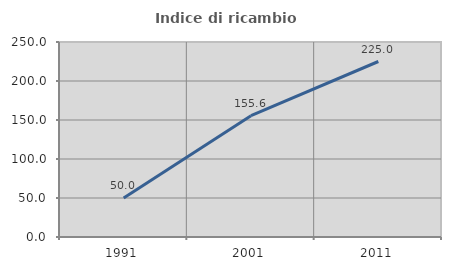
| Category | Indice di ricambio occupazionale  |
|---|---|
| 1991.0 | 50 |
| 2001.0 | 155.556 |
| 2011.0 | 225 |